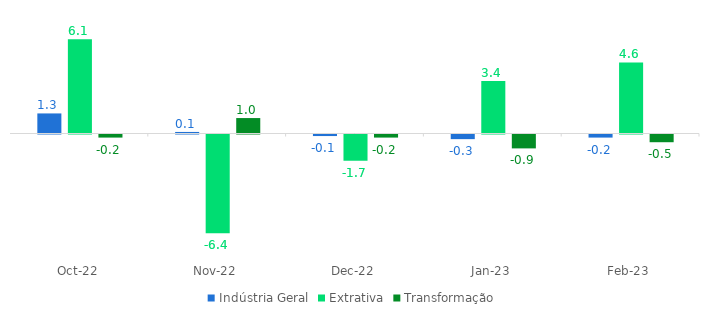
| Category | Indústria Geral | Extrativa | Transformação |
|---|---|---|---|
| 2023-02-01 | -0.2 | 4.6 | -0.5 |
| 2023-01-01 | -0.3 | 3.4 | -0.9 |
| 2022-12-01 | -0.1 | -1.7 | -0.2 |
| 2022-11-01 | 0.1 | -6.4 | 1 |
| 2022-10-01 | 1.3 | 6.1 | -0.2 |